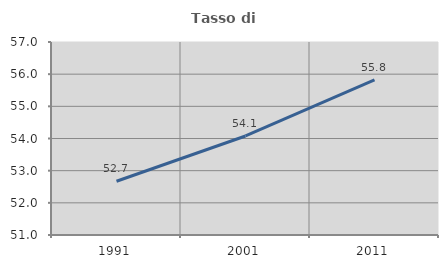
| Category | Tasso di occupazione   |
|---|---|
| 1991.0 | 52.67 |
| 2001.0 | 54.078 |
| 2011.0 | 55.825 |